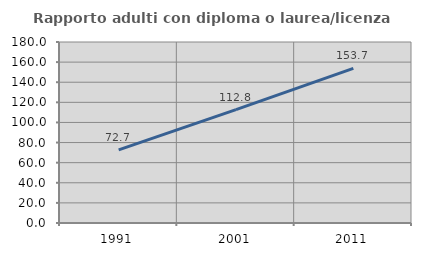
| Category | Rapporto adulti con diploma o laurea/licenza media  |
|---|---|
| 1991.0 | 72.746 |
| 2001.0 | 112.768 |
| 2011.0 | 153.746 |